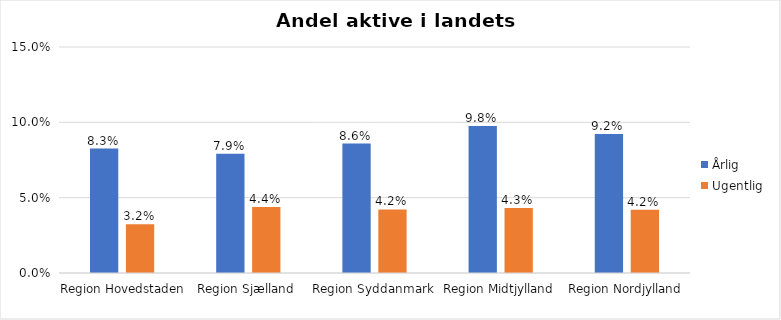
| Category | Årlig | Ugentlig |
|---|---|---|
| Region Hovedstaden | 0.083 | 0.032 |
| Region Sjælland | 0.079 | 0.044 |
| Region Syddanmark | 0.086 | 0.042 |
| Region Midtjylland | 0.098 | 0.043 |
| Region Nordjylland | 0.092 | 0.042 |